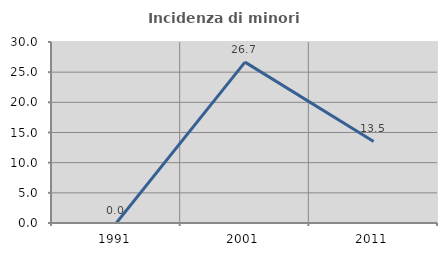
| Category | Incidenza di minori stranieri |
|---|---|
| 1991.0 | 0 |
| 2001.0 | 26.667 |
| 2011.0 | 13.514 |